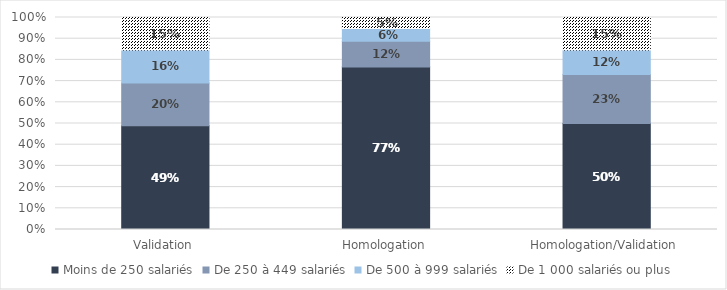
| Category | Moins de 250 salariés | De 250 à 449 salariés | De 500 à 999 salariés | De 1 000 salariés ou plus |
|---|---|---|---|---|
| Validation | 0.49 | 0.201 | 0.156 | 0.153 |
| Homologation | 0.766 | 0.122 | 0.061 | 0.051 |
| Homologation/Validation | 0.5 | 0.231 | 0.115 | 0.154 |